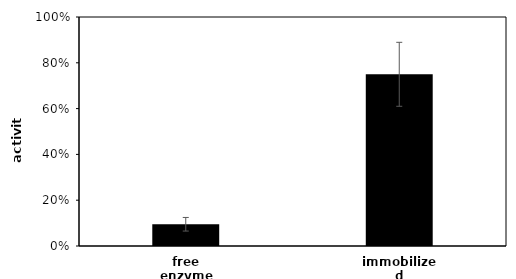
| Category | free enzyme |
|---|---|
| free enzyme | 0.095 |
| immobilized | 0.75 |